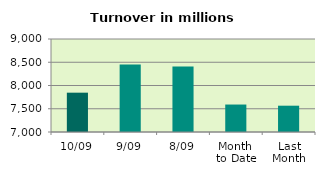
| Category | Series 0 |
|---|---|
| 10/09 | 7845.692 |
| 9/09 | 8449.136 |
| 8/09 | 8410.655 |
| Month 
to Date | 7590.654 |
| Last
Month | 7565.704 |